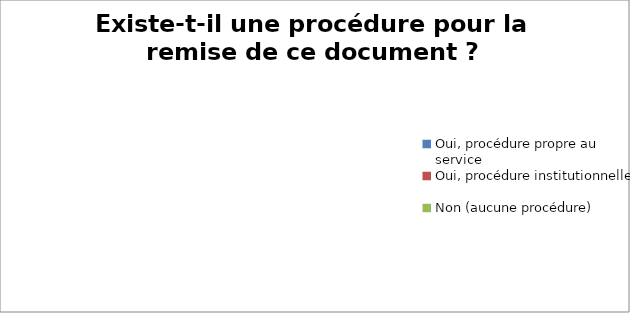
| Category | Existe-t-il une procédure pour la remise de ce document ? |
|---|---|
| Oui, procédure propre au service | 0 |
| Oui, procédure institutionnelle | 0 |
| Non (aucune procédure) | 0 |